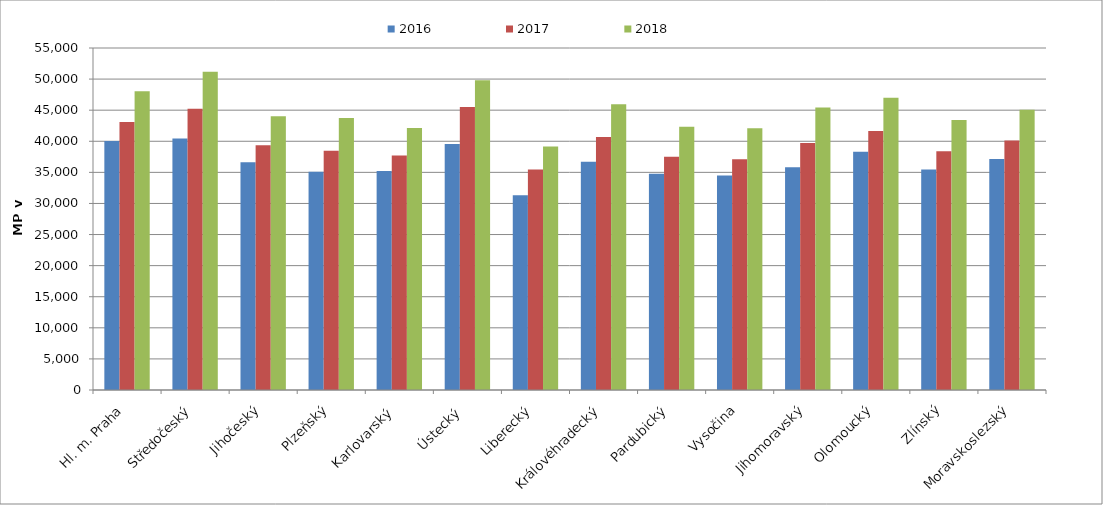
| Category | 2016 | 2017 | 2018 |
|---|---|---|---|
| Hl. m. Praha | 40054.702 | 43099.932 | 48032.241 |
| Středočeský | 40464.232 | 45224.004 | 51185.876 |
| Jihočeský | 36611.544 | 39346.264 | 44040.975 |
| Plzeňský | 35091.745 | 38484.403 | 43740.287 |
| Karlovarský  | 35203.609 | 37713.503 | 42138.541 |
| Ústecký   | 39564.345 | 45511.378 | 49806.735 |
| Liberecký | 31338.792 | 35443.653 | 39176.742 |
| Královéhradecký | 36713.785 | 40686.605 | 45954.823 |
| Pardubický | 34759.816 | 37528.029 | 42320.683 |
| Vysočina | 34482.858 | 37091.629 | 42098.785 |
| Jihomoravský | 35825.934 | 39729.348 | 45417.787 |
| Olomoucký | 38333.971 | 41646.211 | 47000.567 |
| Zlínský | 35453.002 | 38381.664 | 43406.354 |
| Moravskoslezský | 37130.413 | 40129.756 | 45082.161 |